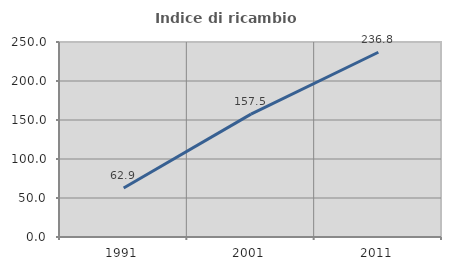
| Category | Indice di ricambio occupazionale  |
|---|---|
| 1991.0 | 62.903 |
| 2001.0 | 157.534 |
| 2011.0 | 236.842 |